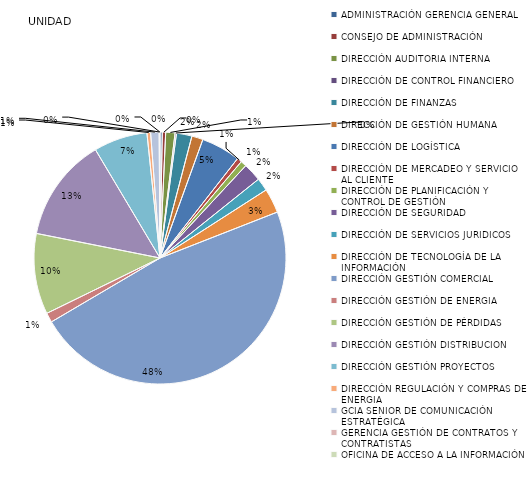
| Category | Series 0 |
|---|---|
| ADMINISTRACIÓN GERENCIA GENERAL | 8 |
| CONSEJO DE ADMINISTRACIÓN | 12 |
| DIRECCIÓN AUDITORIA INTERNA | 33 |
| DIRECCIÓN DE CONTROL FINANCIERO | 5 |
| DIRECCIÓN DE FINANZAS | 55 |
| DIRECCIÓN DE GESTIÓN HUMANA | 40 |
| DIRECCIÓN DE LOGÍSTICA | 139 |
| DIRECCIÓN DE MERCADEO Y SERVICIO AL CLIENTE | 17 |
| DIRECCIÓN DE PLANIFICACIÓN Y CONTROL DE GESTIÓN  | 21 |
| DIRECCIÓN DE SEGURIDAD  | 65 |
| DIRECCIÓN DE SERVICIOS JURIDICOS | 46 |
| DIRECCIÓN DE TECNOLOGÍA DE LA INFORMACIÓN | 87 |
| DIRECCIÓN GESTIÓN COMERCIAL | 1315 |
| DIRECCIÓN GESTIÓN DE ENERGIA  | 34 |
| DIRECCIÓN GESTIÓN DE PÉRDIDAS | 287 |
| DIRECCIÓN GESTIÓN DISTRIBUCION | 369 |
| DIRECCIÓN GESTIÓN PROYECTOS | 191 |
| DIRECCIÓN REGULACIÓN Y COMPRAS DE ENERGIA | 13 |
| GCIA SENIOR DE COMUNICACIÓN ESTRATÉGICA | 30 |
| GERENCIA GESTIÓN DE CONTRATOS Y CONTRATISTAS | 2 |
| OFICINA DE ACCESO A LA INFORMACIÓN | 1 |